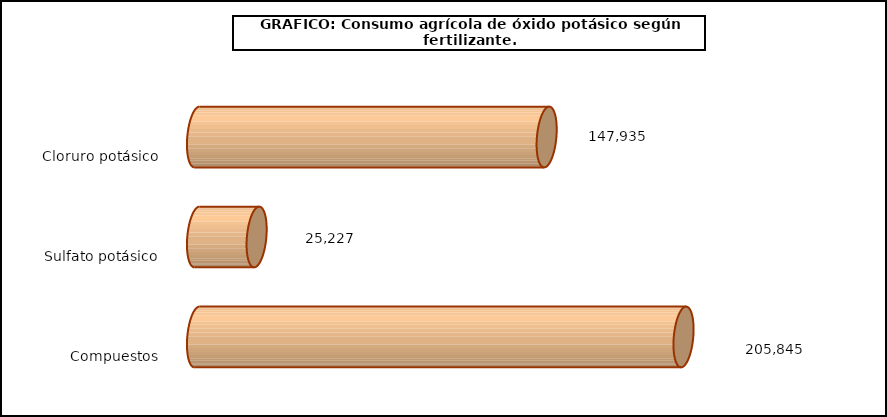
| Category | fert. N |
|---|---|
| 0 | 147935 |
| 1 | 25227 |
| 2 | 205845 |